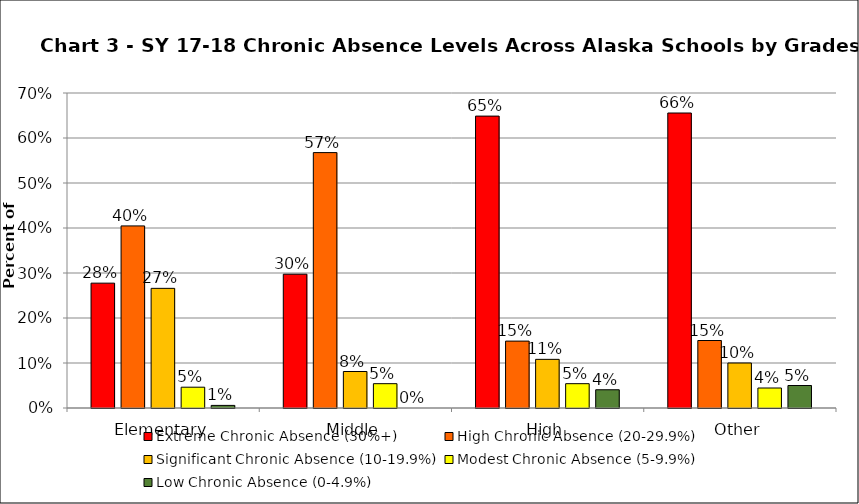
| Category | Extreme Chronic Absence (30%+) | High Chronic Absence (20-29.9%) | Significant Chronic Absence (10-19.9%) | Modest Chronic Absence (5-9.9%) | Low Chronic Absence (0-4.9%) |
|---|---|---|---|---|---|
| 0 | 0.277 | 0.405 | 0.266 | 0.046 | 0.006 |
| 1 | 0.297 | 0.568 | 0.081 | 0.054 | 0 |
| 2 | 0.649 | 0.149 | 0.108 | 0.054 | 0.041 |
| 3 | 0.656 | 0.15 | 0.1 | 0.044 | 0.05 |